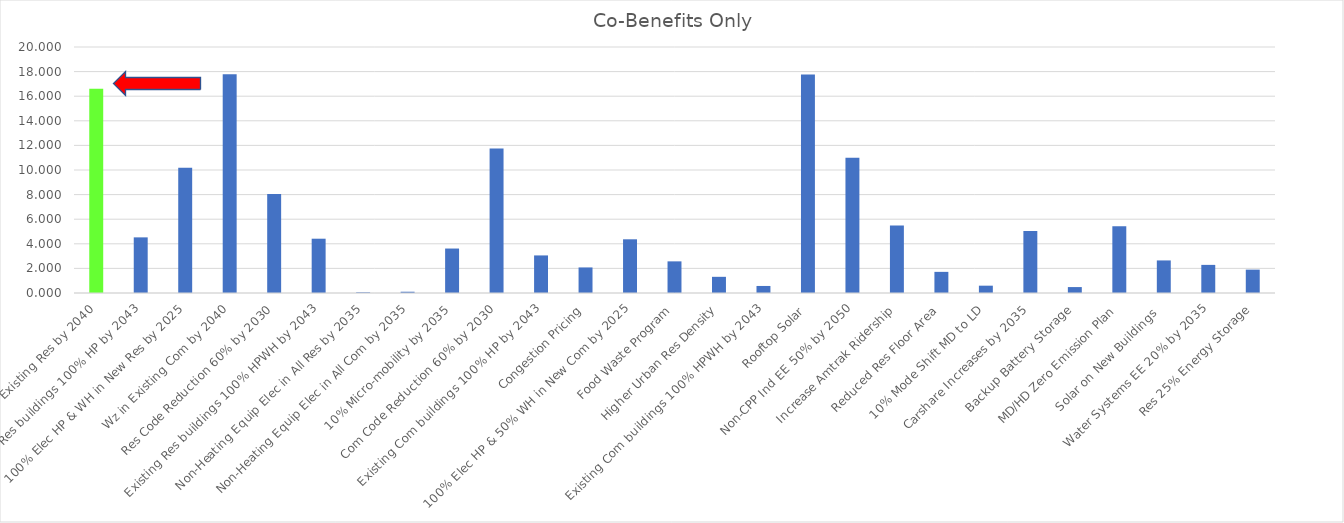
| Category | GHGE (MMTCO2) |
|---|---|
| Wz in Existing Res by 2040 | 16.61 |
| Existing Res buildings 100% HP by 2043 | 4.523 |
| 100% Elec HP & WH in New Res by 2025 | 10.182 |
| Wz in Existing Com by 2040 | 17.791 |
| Res Code Reduction 60% by 2030 | 8.044 |
| Existing Res buildings 100% HPWH by 2043 | 4.414 |
| Non-Heating Equip Elec in All Res by 2035 | 0.055 |
| Non-Heating Equip Elec in All Com by 2035 | 0.103 |
| 10% Micro-mobility by 2035 | 3.615 |
| Com Code Reduction 60% by 2030 | 11.751 |
| Existing Com buildings 100% HP by 2043 | 3.055 |
| Congestion Pricing | 2.078 |
| 100% Elec HP & 50% WH in New Com by 2025 | 4.366 |
| Food Waste Program | 2.572 |
| Higher Urban Res Density | 1.315 |
| Existing Com buildings 100% HPWH by 2043 | 0.572 |
| Rooftop Solar | 17.757 |
| Non-CPP Ind EE 50% by 2050 | 10.987 |
| Increase Amtrak Ridership | 5.497 |
| Reduced Res Floor Area | 1.718 |
| 10% Mode Shift MD to LD | 0.595 |
| Carshare Increases by 2035 | 5.042 |
| Backup Battery Storage | 0.482 |
| MD/HD Zero Emission Plan | 5.419 |
| Solar on New Buildings  | 2.648 |
| Water Systems EE 20% by 2035 | 2.286 |
| Res 25% Energy Storage | 1.9 |